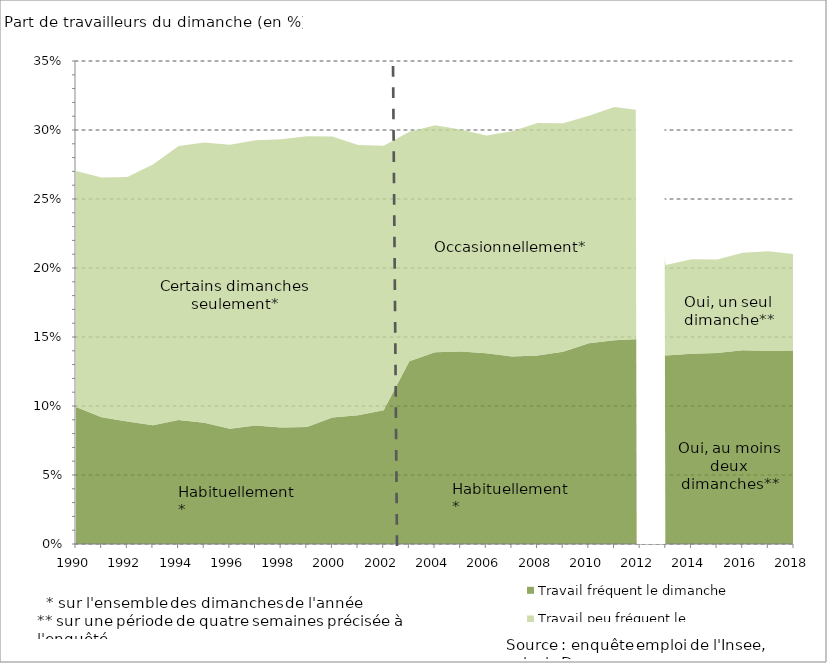
| Category | Travail fréquent le dimanche | Travail peu fréquent le dimanche |
|---|---|---|
| 1990.0 | 0.099 | 0.171 |
| 1991.0 | 0.092 | 0.174 |
| 1992.0 | 0.089 | 0.177 |
| 1993.0 | 0.086 | 0.189 |
| 1994.0 | 0.09 | 0.199 |
| 1995.0 | 0.088 | 0.203 |
| 1996.0 | 0.083 | 0.206 |
| 1997.0 | 0.086 | 0.207 |
| 1998.0 | 0.084 | 0.209 |
| 1999.0 | 0.085 | 0.211 |
| 2000.0 | 0.092 | 0.204 |
| 2001.0 | 0.093 | 0.196 |
| 2002.0 | 0.097 | 0.192 |
| 2003.0 | 0.132 | 0.166 |
| 2004.0 | 0.139 | 0.165 |
| 2005.0 | 0.14 | 0.161 |
| 2006.0 | 0.138 | 0.158 |
| 2007.0 | 0.136 | 0.163 |
| 2008.0 | 0.137 | 0.168 |
| 2009.0 | 0.139 | 0.165 |
| 2010.0 | 0.146 | 0.165 |
| 2011.0 | 0.148 | 0.169 |
| 2012.0 | 0.149 | 0.166 |
| 2013.0 | 0.137 | 0.066 |
| 2014.0 | 0.138 | 0.069 |
| 2015.0 | 0.138 | 0.068 |
| 2016.0 | 0.14 | 0.071 |
| 2017.0 | 0.14 | 0.072 |
| 2018.0 | 0.14 | 0.07 |